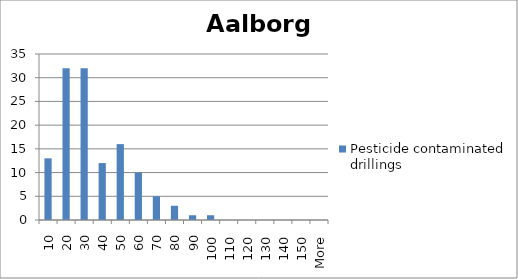
| Category | Pesticide contaminated drillings |
|---|---|
| 10 | 13 |
| 20 | 32 |
| 30 | 32 |
| 40 | 12 |
| 50 | 16 |
| 60 | 10 |
| 70 | 5 |
| 80 | 3 |
| 90 | 1 |
| 100 | 1 |
| 110 | 0 |
| 120 | 0 |
| 130 | 0 |
| 140 | 0 |
| 150 | 0 |
| More | 0 |